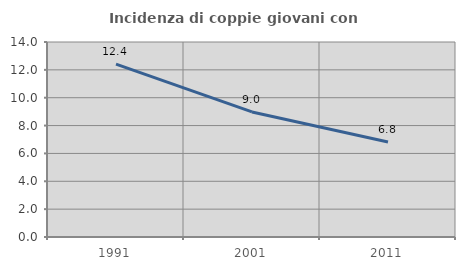
| Category | Incidenza di coppie giovani con figli |
|---|---|
| 1991.0 | 12.409 |
| 2001.0 | 8.981 |
| 2011.0 | 6.823 |